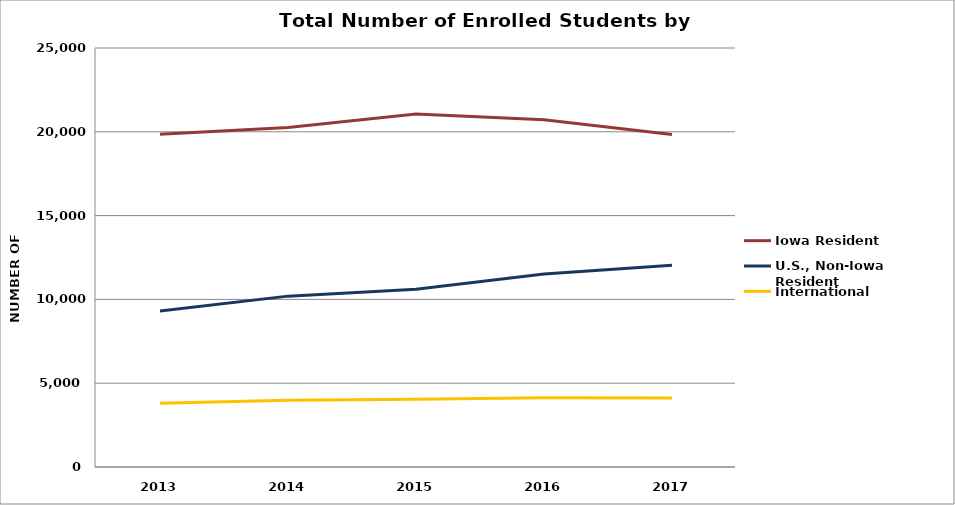
| Category | Iowa Resident | U.S., Non-Iowa Resident | International |
|---|---|---|---|
| 2013.0 | 19850 | 9308 | 3797 |
| 2014.0 | 20260 | 10195 | 3980 |
| 2015.0 | 21064 | 10609 | 4041 |
| 2016.0 | 20713 | 11509 | 4131 |
| 2017.0 | 19843 | 12035 | 4115 |